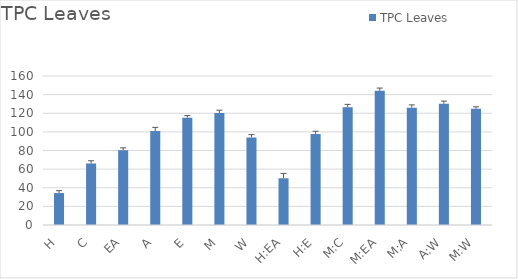
| Category | TPC Leaves  |
|---|---|
| H | 34.292 |
| C | 66.053 |
| EA | 80.321 |
| A | 100.861 |
| E | 115.274 |
| M | 120.389 |
| W | 94.006 |
| H:EA | 50.165 |
| H:E | 97.782 |
| M:C | 126.466 |
| M:EA | 144.133 |
| M:A | 125.986 |
| A:W | 130.186 |
| M:W | 124.959 |